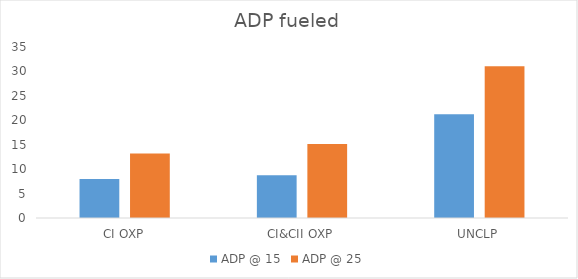
| Category | ADP @ 15 | ADP @ 25 |
|---|---|---|
| CI OXP | 8.003 | 13.206 |
| CI&CII OXP | 8.742 | 15.121 |
| UNCLP | 21.22 | 31.038 |